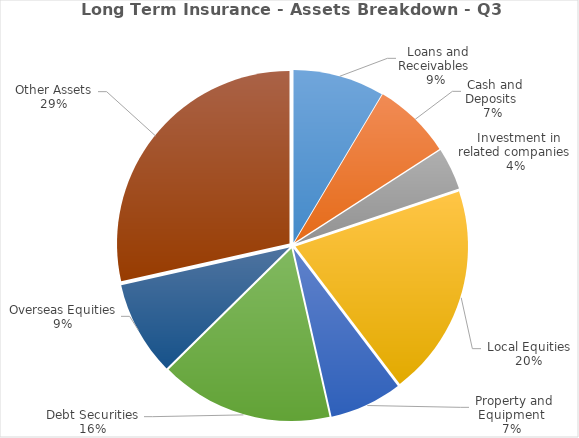
| Category | Series 0 |
|---|---|
| Loans and Receivables | 9005313912.703 |
| Cash and Deposits | 7729683333.28 |
| Investment in related companies | 4174132668 |
| Local Equities | 20886216818.3 |
| Property and Equipment | 7157479417.66 |
| Debt Securities | 17042679117.34 |
| Overseas Equities | 9337838529.47 |
| Other Assets | 30041192027.52 |